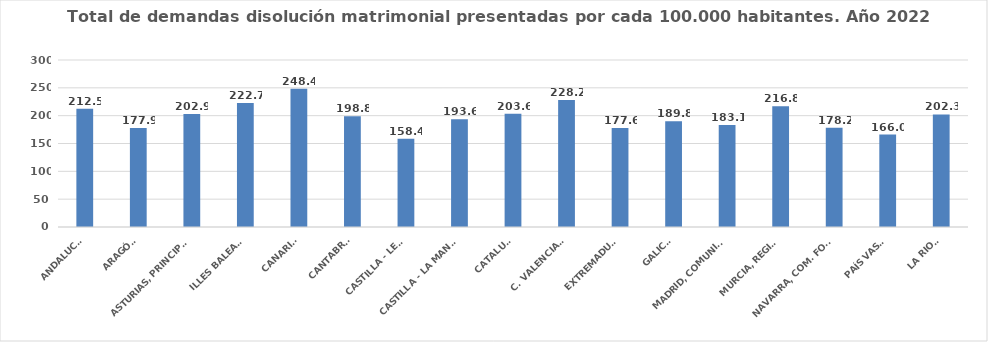
| Category | Series 0 |
|---|---|
| ANDALUCÍA | 212.539 |
| ARAGÓN | 177.944 |
| ASTURIAS, PRINCIPADO | 202.907 |
| ILLES BALEARS | 222.675 |
| CANARIAS | 248.419 |
| CANTABRIA | 198.8 |
| CASTILLA - LEÓN | 158.363 |
| CASTILLA - LA MANCHA | 193.602 |
| CATALUÑA | 203.636 |
| C. VALENCIANA | 228.246 |
| EXTREMADURA | 177.631 |
| GALICIA | 189.751 |
| MADRID, COMUNIDAD | 183.092 |
| MURCIA, REGIÓN | 216.795 |
| NAVARRA, COM. FORAL | 178.221 |
| PAÍS VASCO | 166.035 |
| LA RIOJA | 202.316 |